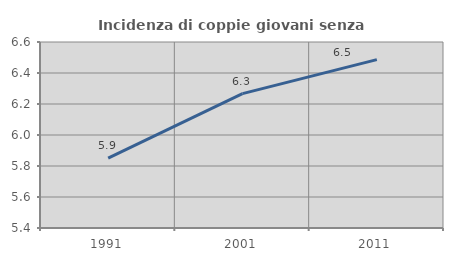
| Category | Incidenza di coppie giovani senza figli |
|---|---|
| 1991.0 | 5.85 |
| 2001.0 | 6.267 |
| 2011.0 | 6.486 |